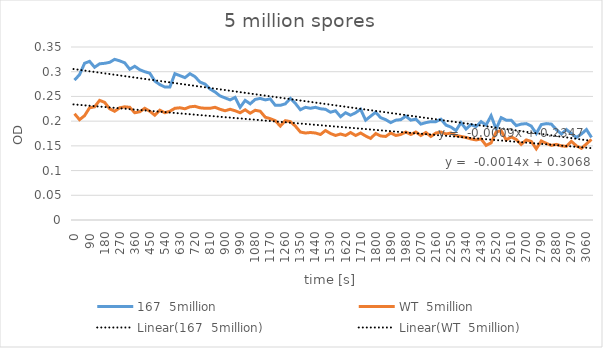
| Category | 167  5million | WT  5million |
|---|---|---|
| 0.0 | 0.283 | 0.215 |
| 30.0 | 0.294 | 0.203 |
| 60.0 | 0.317 | 0.211 |
| 90.0 | 0.321 | 0.227 |
| 120.0 | 0.309 | 0.229 |
| 150.0 | 0.316 | 0.242 |
| 180.0 | 0.317 | 0.238 |
| 210.0 | 0.319 | 0.225 |
| 240.0 | 0.325 | 0.22 |
| 270.0 | 0.322 | 0.227 |
| 300.0 | 0.318 | 0.229 |
| 330.0 | 0.305 | 0.228 |
| 360.0 | 0.311 | 0.217 |
| 390.0 | 0.304 | 0.219 |
| 420.0 | 0.3 | 0.226 |
| 450.0 | 0.297 | 0.22 |
| 480.0 | 0.281 | 0.212 |
| 510.0 | 0.274 | 0.222 |
| 540.0 | 0.269 | 0.217 |
| 570.0 | 0.269 | 0.22 |
| 600.0 | 0.296 | 0.226 |
| 630.0 | 0.292 | 0.227 |
| 660.0 | 0.288 | 0.225 |
| 690.0 | 0.296 | 0.229 |
| 720.0 | 0.29 | 0.23 |
| 750.0 | 0.279 | 0.227 |
| 780.0 | 0.275 | 0.226 |
| 810.0 | 0.265 | 0.226 |
| 840.0 | 0.259 | 0.228 |
| 870.0 | 0.251 | 0.224 |
| 900.0 | 0.247 | 0.221 |
| 930.0 | 0.243 | 0.224 |
| 960.0 | 0.248 | 0.221 |
| 990.0 | 0.228 | 0.217 |
| 1020.0 | 0.242 | 0.223 |
| 1050.0 | 0.235 | 0.216 |
| 1080.0 | 0.244 | 0.222 |
| 1110.0 | 0.246 | 0.22 |
| 1140.0 | 0.243 | 0.208 |
| 1170.0 | 0.245 | 0.205 |
| 1200.0 | 0.232 | 0.201 |
| 1230.0 | 0.232 | 0.19 |
| 1260.0 | 0.235 | 0.201 |
| 1290.0 | 0.246 | 0.199 |
| 1320.0 | 0.236 | 0.19 |
| 1350.0 | 0.223 | 0.178 |
| 1380.0 | 0.228 | 0.176 |
| 1410.0 | 0.226 | 0.177 |
| 1440.0 | 0.228 | 0.176 |
| 1470.0 | 0.225 | 0.173 |
| 1500.0 | 0.224 | 0.181 |
| 1530.0 | 0.218 | 0.175 |
| 1560.0 | 0.221 | 0.171 |
| 1590.0 | 0.209 | 0.174 |
| 1620.0 | 0.217 | 0.171 |
| 1650.0 | 0.212 | 0.177 |
| 1680.0 | 0.217 | 0.171 |
| 1710.0 | 0.224 | 0.176 |
| 1740.0 | 0.202 | 0.17 |
| 1770.0 | 0.21 | 0.165 |
| 1800.0 | 0.218 | 0.175 |
| 1830.0 | 0.207 | 0.17 |
| 1860.0 | 0.203 | 0.169 |
| 1890.0 | 0.197 | 0.176 |
| 1920.0 | 0.202 | 0.171 |
| 1950.0 | 0.203 | 0.173 |
| 1980.0 | 0.21 | 0.178 |
| 2010.0 | 0.202 | 0.173 |
| 2040.0 | 0.204 | 0.178 |
| 2070.0 | 0.194 | 0.171 |
| 2100.0 | 0.197 | 0.177 |
| 2130.0 | 0.199 | 0.169 |
| 2160.0 | 0.199 | 0.176 |
| 2190.0 | 0.204 | 0.178 |
| 2220.0 | 0.192 | 0.174 |
| 2250.0 | 0.188 | 0.176 |
| 2280.0 | 0.181 | 0.171 |
| 2310.0 | 0.197 | 0.169 |
| 2340.0 | 0.184 | 0.167 |
| 2370.0 | 0.193 | 0.164 |
| 2400.0 | 0.189 | 0.162 |
| 2430.0 | 0.199 | 0.164 |
| 2460.0 | 0.192 | 0.151 |
| 2490.0 | 0.211 | 0.156 |
| 2520.0 | 0.184 | 0.178 |
| 2550.0 | 0.207 | 0.181 |
| 2580.0 | 0.202 | 0.162 |
| 2610.0 | 0.202 | 0.168 |
| 2640.0 | 0.191 | 0.163 |
| 2670.0 | 0.194 | 0.153 |
| 2700.0 | 0.195 | 0.162 |
| 2730.0 | 0.19 | 0.159 |
| 2760.0 | 0.175 | 0.144 |
| 2790.0 | 0.193 | 0.16 |
| 2820.0 | 0.195 | 0.155 |
| 2850.0 | 0.194 | 0.151 |
| 2880.0 | 0.183 | 0.153 |
| 2910.0 | 0.174 | 0.15 |
| 2940.0 | 0.183 | 0.149 |
| 2970.0 | 0.175 | 0.159 |
| 3000.0 | 0.167 | 0.15 |
| 3030.0 | 0.174 | 0.145 |
| 3060.0 | 0.183 | 0.154 |
| 3090.0 | 0.167 | 0.163 |